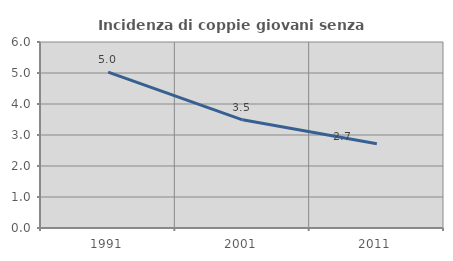
| Category | Incidenza di coppie giovani senza figli |
|---|---|
| 1991.0 | 5.027 |
| 2001.0 | 3.489 |
| 2011.0 | 2.716 |